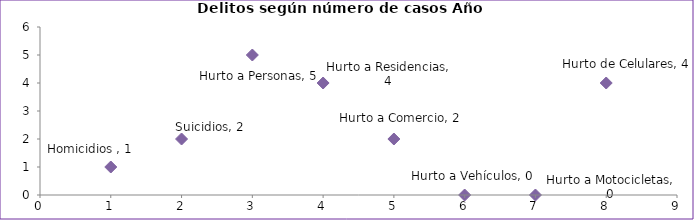
| Category | Series 0 |
|---|---|
| 0 | 1 |
| 1 | 2 |
| 2 | 5 |
| 3 | 4 |
| 4 | 2 |
| 5 | 0 |
| 6 | 0 |
| 7 | 4 |